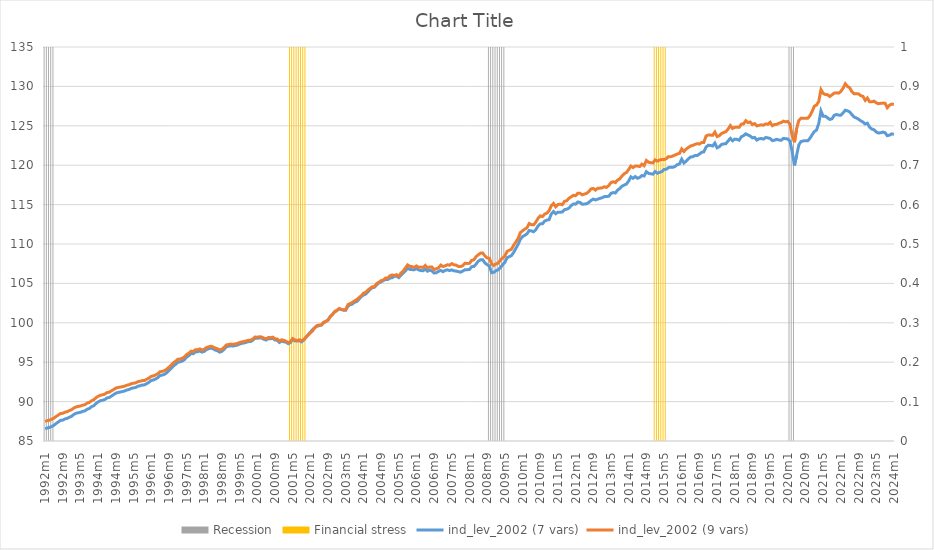
| Category | Recession | Financial stress |
|---|---|---|
| 1992m1 | 1 | 0 |
| 1992m2 | 1 | 0 |
| 1992m3 | 1 | 0 |
| 1992m4 | 1 | 0 |
| 1992m5 | 1 | 0 |
| 1992m6 | 0 | 0 |
| 1992m7 | 0 | 0 |
| 1992m8 | 0 | 0 |
| 1992m9 | 0 | 0 |
| 1992m10 | 0 | 0 |
| 1992m11 | 0 | 0 |
| 1992m12 | 0 | 0 |
| 1993m1 | 0 | 0 |
| 1993m2 | 0 | 0 |
| 1993m3 | 0 | 0 |
| 1993m4 | 0 | 0 |
| 1993m5 | 0 | 0 |
| 1993m6 | 0 | 0 |
| 1993m7 | 0 | 0 |
| 1993m8 | 0 | 0 |
| 1993m9 | 0 | 0 |
| 1993m10 | 0 | 0 |
| 1993m11 | 0 | 0 |
| 1993m12 | 0 | 0 |
| 1994m1 | 0 | 0 |
| 1994m2 | 0 | 0 |
| 1994m3 | 0 | 0 |
| 1994m4 | 0 | 0 |
| 1994m5 | 0 | 0 |
| 1994m6 | 0 | 0 |
| 1994m7 | 0 | 0 |
| 1994m8 | 0 | 0 |
| 1994m9 | 0 | 0 |
| 1994m10 | 0 | 0 |
| 1994m11 | 0 | 0 |
| 1994m12 | 0 | 0 |
| 1995m1 | 0 | 0 |
| 1995m2 | 0 | 0 |
| 1995m3 | 0 | 0 |
| 1995m4 | 0 | 0 |
| 1995m5 | 0 | 0 |
| 1995m6 | 0 | 0 |
| 1995m7 | 0 | 0 |
| 1995m8 | 0 | 0 |
| 1995m9 | 0 | 0 |
| 1995m10 | 0 | 0 |
| 1995m11 | 0 | 0 |
| 1995m12 | 0 | 0 |
| 1996m1 | 0 | 0 |
| 1996m2 | 0 | 0 |
| 1996m3 | 0 | 0 |
| 1996m4 | 0 | 0 |
| 1996m5 | 0 | 0 |
| 1996m6 | 0 | 0 |
| 1996m7 | 0 | 0 |
| 1996m8 | 0 | 0 |
| 1996m9 | 0 | 0 |
| 1996m10 | 0 | 0 |
| 1996m11 | 0 | 0 |
| 1996m12 | 0 | 0 |
| 1997m1 | 0 | 0 |
| 1997m2 | 0 | 0 |
| 1997m3 | 0 | 0 |
| 1997m4 | 0 | 0 |
| 1997m5 | 0 | 0 |
| 1997m6 | 0 | 0 |
| 1997m7 | 0 | 0 |
| 1997m8 | 0 | 0 |
| 1997m9 | 0 | 0 |
| 1997m10 | 0 | 0 |
| 1997m11 | 0 | 0 |
| 1997m12 | 0 | 0 |
| 1998m1 | 0 | 0 |
| 1998m2 | 0 | 0 |
| 1998m3 | 0 | 0 |
| 1998m4 | 0 | 0 |
| 1998m5 | 0 | 0 |
| 1998m6 | 0 | 0 |
| 1998m7 | 0 | 0 |
| 1998m8 | 0 | 0 |
| 1998m9 | 0 | 0 |
| 1998m10 | 0 | 0 |
| 1998m11 | 0 | 0 |
| 1998m12 | 0 | 0 |
| 1999m1 | 0 | 0 |
| 1999m2 | 0 | 0 |
| 1999m3 | 0 | 0 |
| 1999m4 | 0 | 0 |
| 1999m5 | 0 | 0 |
| 1999m6 | 0 | 0 |
| 1999m7 | 0 | 0 |
| 1999m8 | 0 | 0 |
| 1999m9 | 0 | 0 |
| 1999m10 | 0 | 0 |
| 1999m11 | 0 | 0 |
| 1999m12 | 0 | 0 |
| 2000m1 | 0 | 0 |
| 2000m2 | 0 | 0 |
| 2000m3 | 0 | 0 |
| 2000m4 | 0 | 0 |
| 2000m5 | 0 | 0 |
| 2000m6 | 0 | 0 |
| 2000m7 | 0 | 0 |
| 2000m8 | 0 | 0 |
| 2000m9 | 0 | 0 |
| 2000m10 | 0 | 0 |
| 2000m11 | 0 | 0 |
| 2000m12 | 0 | 0 |
| 2001m1 | 0 | 0 |
| 2001m2 | 0 | 0 |
| 2001m3 | 0 | 0 |
| 2001m4 | 0 | 1 |
| 2001m5 | 0 | 1 |
| 2001m6 | 0 | 1 |
| 2001m7 | 0 | 1 |
| 2001m8 | 0 | 1 |
| 2001m9 | 0 | 1 |
| 2001m10 | 0 | 1 |
| 2001m11 | 0 | 1 |
| 2001m12 | 0 | 0 |
| 2002m1 | 0 | 0 |
| 2002m2 | 0 | 0 |
| 2002m3 | 0 | 0 |
| 2002m4 | 0 | 0 |
| 2002m5 | 0 | 0 |
| 2002m6 | 0 | 0 |
| 2002m7 | 0 | 0 |
| 2002m8 | 0 | 0 |
| 2002m9 | 0 | 0 |
| 2002m10 | 0 | 0 |
| 2002m11 | 0 | 0 |
| 2002m12 | 0 | 0 |
| 2003m1 | 0 | 0 |
| 2003m2 | 0 | 0 |
| 2003m3 | 0 | 0 |
| 2003m4 | 0 | 0 |
| 2003m5 | 0 | 0 |
| 2003m6 | 0 | 0 |
| 2003m7 | 0 | 0 |
| 2003m8 | 0 | 0 |
| 2003m9 | 0 | 0 |
| 2003m10 | 0 | 0 |
| 2003m11 | 0 | 0 |
| 2003m12 | 0 | 0 |
| 2004m1 | 0 | 0 |
| 2004m2 | 0 | 0 |
| 2004m3 | 0 | 0 |
| 2004m4 | 0 | 0 |
| 2004m5 | 0 | 0 |
| 2004m6 | 0 | 0 |
| 2004m7 | 0 | 0 |
| 2004m8 | 0 | 0 |
| 2004m9 | 0 | 0 |
| 2004m10 | 0 | 0 |
| 2004m11 | 0 | 0 |
| 2004m12 | 0 | 0 |
| 2005m1 | 0 | 0 |
| 2005m2 | 0 | 0 |
| 2005m3 | 0 | 0 |
| 2005m4 | 0 | 0 |
| 2005m5 | 0 | 0 |
| 2005m6 | 0 | 0 |
| 2005m7 | 0 | 0 |
| 2005m8 | 0 | 0 |
| 2005m9 | 0 | 0 |
| 2005m10 | 0 | 0 |
| 2005m11 | 0 | 0 |
| 2005m12 | 0 | 0 |
| 2006m1 | 0 | 0 |
| 2006m2 | 0 | 0 |
| 2006m3 | 0 | 0 |
| 2006m4 | 0 | 0 |
| 2006m5 | 0 | 0 |
| 2006m6 | 0 | 0 |
| 2006m7 | 0 | 0 |
| 2006m8 | 0 | 0 |
| 2006m9 | 0 | 0 |
| 2006m10 | 0 | 0 |
| 2006m11 | 0 | 0 |
| 2006m12 | 0 | 0 |
| 2007m1 | 0 | 0 |
| 2007m2 | 0 | 0 |
| 2007m3 | 0 | 0 |
| 2007m4 | 0 | 0 |
| 2007m5 | 0 | 0 |
| 2007m6 | 0 | 0 |
| 2007m7 | 0 | 0 |
| 2007m8 | 0 | 0 |
| 2007m9 | 0 | 0 |
| 2007m10 | 0 | 0 |
| 2007m11 | 0 | 0 |
| 2007m12 | 0 | 0 |
| 2008m1 | 0 | 0 |
| 2008m2 | 0 | 0 |
| 2008m3 | 0 | 0 |
| 2008m4 | 0 | 0 |
| 2008m5 | 0 | 0 |
| 2008m6 | 0 | 0 |
| 2008m7 | 0 | 0 |
| 2008m8 | 0 | 0 |
| 2008m9 | 0 | 0 |
| 2008m10 | 1 | 0 |
| 2008m11 | 1 | 0 |
| 2008m12 | 1 | 0 |
| 2009m1 | 1 | 0 |
| 2009m2 | 1 | 0 |
| 2009m3 | 1 | 0 |
| 2009m4 | 1 | 0 |
| 2009m5 | 1 | 0 |
| 2009m6 | 0 | 0 |
| 2009m7 | 0 | 0 |
| 2009m8 | 0 | 0 |
| 2009m9 | 0 | 0 |
| 2009m10 | 0 | 0 |
| 2009m11 | 0 | 0 |
| 2009m12 | 0 | 0 |
| 2010m1 | 0 | 0 |
| 2010m2 | 0 | 0 |
| 2010m3 | 0 | 0 |
| 2010m4 | 0 | 0 |
| 2010m5 | 0 | 0 |
| 2010m6 | 0 | 0 |
| 2010m7 | 0 | 0 |
| 2010m8 | 0 | 0 |
| 2010m9 | 0 | 0 |
| 2010m10 | 0 | 0 |
| 2010m11 | 0 | 0 |
| 2010m12 | 0 | 0 |
| 2011m1 | 0 | 0 |
| 2011m2 | 0 | 0 |
| 2011m3 | 0 | 0 |
| 2011m4 | 0 | 0 |
| 2011m5 | 0 | 0 |
| 2011m6 | 0 | 0 |
| 2011m7 | 0 | 0 |
| 2011m8 | 0 | 0 |
| 2011m9 | 0 | 0 |
| 2011m10 | 0 | 0 |
| 2011m11 | 0 | 0 |
| 2011m12 | 0 | 0 |
| 2012m1 | 0 | 0 |
| 2012m2 | 0 | 0 |
| 2012m3 | 0 | 0 |
| 2012m4 | 0 | 0 |
| 2012m5 | 0 | 0 |
| 2012m6 | 0 | 0 |
| 2012m7 | 0 | 0 |
| 2012m8 | 0 | 0 |
| 2012m9 | 0 | 0 |
| 2012m10 | 0 | 0 |
| 2012m11 | 0 | 0 |
| 2012m12 | 0 | 0 |
| 2013m1 | 0 | 0 |
| 2013m2 | 0 | 0 |
| 2013m3 | 0 | 0 |
| 2013m4 | 0 | 0 |
| 2013m5 | 0 | 0 |
| 2013m6 | 0 | 0 |
| 2013m7 | 0 | 0 |
| 2013m8 | 0 | 0 |
| 2013m9 | 0 | 0 |
| 2013m10 | 0 | 0 |
| 2013m11 | 0 | 0 |
| 2013m12 | 0 | 0 |
| 2014m1 | 0 | 0 |
| 2014m2 | 0 | 0 |
| 2014m3 | 0 | 0 |
| 2014m4 | 0 | 0 |
| 2014m5 | 0 | 0 |
| 2014m6 | 0 | 0 |
| 2014m7 | 0 | 0 |
| 2014m8 | 0 | 0 |
| 2014m9 | 0 | 0 |
| 2014m10 | 0 | 0 |
| 2014m11 | 0 | 0 |
| 2014m12 | 0 | 0 |
| 2015m1 | 0 | 1 |
| 2015m2 | 0 | 1 |
| 2015m3 | 0 | 1 |
| 2015m4 | 0 | 1 |
| 2015m5 | 0 | 1 |
| 2015m6 | 0 | 1 |
| 2015m7 | 0 | 0 |
| 2015m8 | 0 | 0 |
| 2015m9 | 0 | 0 |
| 2015m10 | 0 | 0 |
| 2015m11 | 0 | 0 |
| 2015m12 | 0 | 0 |
| 2016m1 | 0 | 0 |
| 2016m2 | 0 | 0 |
| 2016m3 | 0 | 0 |
| 2016m4 | 0 | 0 |
| 2016m5 | 0 | 0 |
| 2016m6 | 0 | 0 |
| 2016m7 | 0 | 0 |
| 2016m8 | 0 | 0 |
| 2016m9 | 0 | 0 |
| 2016m10 | 0 | 0 |
| 2016m11 | 0 | 0 |
| 2016m12 | 0 | 0 |
| 2017m1 | 0 | 0 |
| 2017m2 | 0 | 0 |
| 2017m3 | 0 | 0 |
| 2017m4 | 0 | 0 |
| 2017m5 | 0 | 0 |
| 2017m6 | 0 | 0 |
| 2017m7 | 0 | 0 |
| 2017m8 | 0 | 0 |
| 2017m9 | 0 | 0 |
| 2017m10 | 0 | 0 |
| 2017m11 | 0 | 0 |
| 2017m12 | 0 | 0 |
| 2018m1 | 0 | 0 |
| 2018m2 | 0 | 0 |
| 2018m3 | 0 | 0 |
| 2018m4 | 0 | 0 |
| 2018m5 | 0 | 0 |
| 2018m6 | 0 | 0 |
| 2018m7 | 0 | 0 |
| 2018m8 | 0 | 0 |
| 2018m9 | 0 | 0 |
| 2018m10 | 0 | 0 |
| 2018m11 | 0 | 0 |
| 2018m12 | 0 | 0 |
| 2019m1 | 0 | 0 |
| 2019m2 | 0 | 0 |
| 2019m3 | 0 | 0 |
| 2019m4 | 0 | 0 |
| 2019m5 | 0 | 0 |
| 2019m6 | 0 | 0 |
| 2019m7 | 0 | 0 |
| 2019m8 | 0 | 0 |
| 2019m9 | 0 | 0 |
| 2019m10 | 0 | 0 |
| 2019m11 | 0 | 0 |
| 2019m12 | 0 | 0 |
| 2020m1 | 0 | 0 |
| 2020m2 | 1 | 0 |
| 2020m3 | 1 | 0 |
| 2020m4 | 1 | 0 |
| 2020m5 | 0 | 0 |
| 2020m6 | 0 | 0 |
| 2020m7 | 0 | 0 |
| 2020m8 | 0 | 0 |
| 2020m9 | 0 | 0 |
| 2020m10 | 0 | 0 |
| 2020m11 | 0 | 0 |
| 2020m12 | 0 | 0 |
| 2021m1 | 0 | 0 |
| 2021m2 | 0 | 0 |
| 2021m3 | 0 | 0 |
| 2021m4 | 0 | 0 |
| 2021m5 | 0 | 0 |
| 2021m6 | 0 | 0 |
| 2021m7 | 0 | 0 |
| 2021m8 | 0 | 0 |
| 2021m9 | 0 | 0 |
| 2021m10 | 0 | 0 |
| 2021m11 | 0 | 0 |
| 2021m12 | 0 | 0 |
| 2022m1 | 0 | 0 |
| 2022m2 | 0 | 0 |
| 2022m3 | 0 | 0 |
| 2022m4 | 0 | 0 |
| 2022m5 | 0 | 0 |
| 2022m6 | 0 | 0 |
| 2022m7 | 0 | 0 |
| 2022m8 | 0 | 0 |
| 2022m9 | 0 | 0 |
| 2022m10 | 0 | 0 |
| 2022m11 | 0 | 0 |
| 2022m12 | 0 | 0 |
| 2023m1 | 0 | 0 |
| 2023m2 | 0 | 0 |
| 2023m3 | 0 | 0 |
| 2023m4 | 0 | 0 |
| 2023m5 | 0 | 0 |
| 2023m6 | 0 | 0 |
| 2023m7 | 0 | 0 |
| 2023m8 | 0 | 0 |
| 2023m9 | 0 | 0 |
| 2023m10 | 0 | 0 |
| 2023m11 | 0 | 0 |
| 2023m12 | 0 | 0 |
| 2024m1 | 0 | 0 |